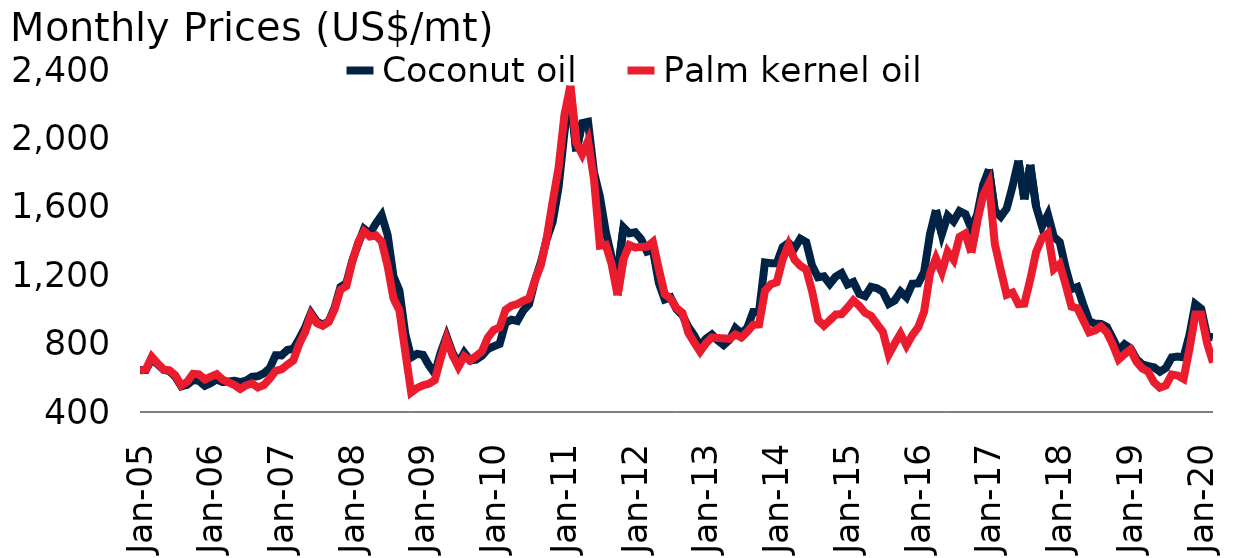
| Category | Coconut oil | Palm kernel oil |
|---|---|---|
| 2005-01-01 | 646 | 641.19 |
| 2005-02-01 | 646 | 649.4 |
| 2005-03-01 | 710 | 722.61 |
| 2005-04-01 | 679 | 684.33 |
| 2005-05-01 | 647 | 648.09 |
| 2005-06-01 | 638.75 | 644 |
| 2005-07-01 | 606 | 614.52 |
| 2005-08-01 | 550 | 555.22 |
| 2005-09-01 | 559 | 576.14 |
| 2005-10-01 | 587 | 623.33 |
| 2005-11-01 | 582 | 620.23 |
| 2005-12-01 | 553 | 590.8 |
| 2006-01-01 | 569 | 606.02 |
| 2006-02-01 | 591 | 621.13 |
| 2006-03-01 | 575 | 590 |
| 2006-04-01 | 578 | 573.75 |
| 2006-05-01 | 583 | 558.26 |
| 2006-06-01 | 575 | 534.77 |
| 2006-07-01 | 583.25 | 555.71 |
| 2006-08-01 | 606 | 566.85 |
| 2006-09-01 | 609 | 543.57 |
| 2006-10-01 | 626 | 557.61 |
| 2006-11-01 | 656 | 594.43 |
| 2006-12-01 | 731.667 | 640.71 |
| 2007-01-01 | 731 | 649.13 |
| 2007-02-01 | 763 | 676.75 |
| 2007-03-01 | 769 | 701.14 |
| 2007-04-01 | 827.5 | 797.26 |
| 2007-05-01 | 894 | 866.85 |
| 2007-06-01 | 979 | 968.33 |
| 2007-07-01 | 929 | 919.55 |
| 2007-08-01 | 910 | 904.02 |
| 2007-09-01 | 930 | 926.63 |
| 2007-10-01 | 1010 | 999.67 |
| 2007-11-01 | 1131 | 1115 |
| 2007-12-01 | 1153 | 1136.53 |
| 2008-01-01 | 1285 | 1278.18 |
| 2008-02-01 | 1382 | 1391.67 |
| 2008-03-01 | 1471 | 1456.39 |
| 2008-04-01 | 1443 | 1425.91 |
| 2008-05-01 | 1502 | 1432.5 |
| 2008-06-01 | 1551 | 1396.67 |
| 2008-07-01 | 1436 | 1253.48 |
| 2008-08-01 | 1193 | 1064.29 |
| 2008-09-01 | 1110 | 994.09 |
| 2008-10-01 | 856 | 750.65 |
| 2008-11-01 | 719 | 514.5 |
| 2008-12-01 | 740 | 540.24 |
| 2009-01-01 | 734 | 556 |
| 2009-02-01 | 673 | 565.25 |
| 2009-03-01 | 625 | 586.25 |
| 2009-04-01 | 747 | 713.5 |
| 2009-05-01 | 842.5 | 826.84 |
| 2009-06-01 | 747 | 732.62 |
| 2009-07-01 | 685 | 663.91 |
| 2009-08-01 | 747 | 726.19 |
| 2009-09-01 | 701 | 700.68 |
| 2009-10-01 | 706 | 727.05 |
| 2009-11-01 | 729 | 754.52 |
| 2009-12-01 | 768 | 835.45 |
| 2010-01-01 | 784 | 879.5 |
| 2010-02-01 | 798 | 894 |
| 2010-03-01 | 921 | 996.96 |
| 2010-04-01 | 940 | 1021.05 |
| 2010-05-01 | 932 | 1031.05 |
| 2010-06-01 | 993 | 1050 |
| 2010-07-01 | 1031 | 1063.86 |
| 2010-08-01 | 1170 | 1171.14 |
| 2010-09-01 | 1275 | 1259.66 |
| 2010-10-01 | 1412 | 1420.95 |
| 2010-11-01 | 1512 | 1631.14 |
| 2010-12-01 | 1715 | 1829.55 |
| 2011-01-01 | 2038 | 2139.05 |
| 2011-02-01 | 2256 | 2307.63 |
| 2011-03-01 | 1925 | 1975.22 |
| 2011-04-01 | 2089 | 1906.32 |
| 2011-05-01 | 2097 | 1985.48 |
| 2011-06-01 | 1803 | 1761.75 |
| 2011-07-01 | 1662 | 1372.62 |
| 2011-08-01 | 1454 | 1377.83 |
| 2011-09-01 | 1305 | 1264.32 |
| 2011-10-01 | 1208 | 1082.62 |
| 2011-11-01 | 1479 | 1294.32 |
| 2011-12-01 | 1445 | 1376.58 |
| 2012-01-01 | 1451 | 1362.05 |
| 2012-02-01 | 1411 | 1365.48 |
| 2012-03-01 | 1338 | 1366.43 |
| 2012-04-01 | 1348 | 1394.72 |
| 2012-05-01 | 1155 | 1236.75 |
| 2012-06-01 | 1058 | 1089.05 |
| 2012-07-01 | 1070 | 1063.18 |
| 2012-08-01 | 1001 | 1007.61 |
| 2012-09-01 | 967 | 980 |
| 2012-10-01 | 898 | 863.04 |
| 2012-11-01 | 848 | 806.7 |
| 2012-12-01 | 785 | 753.53 |
| 2013-01-01 | 828.64 | 801.36 |
| 2013-02-01 | 853.25 | 836 |
| 2013-03-01 | 818.75 | 832.75 |
| 2013-04-01 | 791.43 | 830.71 |
| 2013-05-01 | 822.5 | 827.5 |
| 2013-06-01 | 890.63 | 853.5 |
| 2013-07-01 | 860.43 | 835.54 |
| 2013-08-01 | 892.61 | 868.64 |
| 2013-09-01 | 985.24 | 909.76 |
| 2013-10-01 | 985.65 | 912.17 |
| 2013-11-01 | 1274.5 | 1108.1 |
| 2013-12-01 | 1270 | 1147 |
| 2014-01-01 | 1269.09 | 1158.64 |
| 2014-02-01 | 1364 | 1292 |
| 2014-03-01 | 1389.05 | 1376.9 |
| 2014-04-01 | 1356.13 | 1291.75 |
| 2014-05-01 | 1413.25 | 1255.25 |
| 2014-06-01 | 1393.25 | 1233.75 |
| 2014-07-01 | 1255.22 | 1106.3 |
| 2014-08-01 | 1187.62 | 938.81 |
| 2014-09-01 | 1193.41 | 904.55 |
| 2014-10-01 | 1148.7 | 936.09 |
| 2014-11-01 | 1191.63 | 970 |
| 2014-12-01 | 1212.14 | 972.26 |
| 2015-01-01 | 1145.71 | 1010.48 |
| 2015-02-01 | 1160.5 | 1052.37 |
| 2015-03-01 | 1090.68 | 1020.8 |
| 2015-04-01 | 1077.5 | 979.75 |
| 2015-05-01 | 1131.94 | 962.06 |
| 2015-06-01 | 1123.64 | 914.43 |
| 2015-07-01 | 1103.04 | 869.13 |
| 2015-08-01 | 1032.38 | 735.48 |
| 2015-09-01 | 1051.59 | 799.66 |
| 2015-10-01 | 1104.09 | 857.73 |
| 2015-11-01 | 1071.07 | 788.75 |
| 2015-12-01 | 1150 | 849.55 |
| 2016-01-01 | 1152 | 895.63 |
| 2016-02-01 | 1218.93 | 986.9 |
| 2016-03-01 | 1440.48 | 1210.6 |
| 2016-04-01 | 1580.95 | 1299.05 |
| 2016-05-01 | 1439.5 | 1218.25 |
| 2016-06-01 | 1547.95 | 1337.27 |
| 2016-07-01 | 1515 | 1290 |
| 2016-08-01 | 1575 | 1423.7 |
| 2016-09-01 | 1557.39 | 1443.86 |
| 2016-10-01 | 1473.57 | 1331.19 |
| 2016-11-01 | 1553.41 | 1512.95 |
| 2016-12-01 | 1727.14 | 1666.43 |
| 2017-01-01 | 1818.64 | 1737.27 |
| 2017-02-01 | 1575.63 | 1381.88 |
| 2017-03-01 | 1542.39 | 1229.57 |
| 2017-04-01 | 1589.72 | 1085.56 |
| 2017-05-01 | 1719.29 | 1098.57 |
| 2017-06-01 | 1869.76 | 1030.83 |
| 2017-07-01 | 1644.05 | 1033.57 |
| 2017-08-01 | 1845 | 1174.35 |
| 2017-09-01 | 1600.95 | 1336.05 |
| 2017-10-01 | 1484.77 | 1418.86 |
| 2017-11-01 | 1554.32 | 1444.77 |
| 2017-12-01 | 1425 | 1235.63 |
| 2018-01-01 | 1393.86 | 1265 |
| 2018-02-01 | 1244.25 | 1145.38 |
| 2018-03-01 | 1118.63 | 1016.19 |
| 2018-04-01 | 1131.18 | 1006.71 |
| 2018-05-01 | 1027.75 | 935.25 |
| 2018-06-01 | 931.19 | 865.71 |
| 2018-07-01 | 916.25 | 877.16 |
| 2018-08-01 | 915.22 | 900.22 |
| 2018-09-01 | 897.13 | 865.63 |
| 2018-10-01 | 830.25 | 794.49 |
| 2018-11-01 | 759.26 | 707.62 |
| 2018-12-01 | 796.27 | 738.36 |
| 2019-01-01 | 773.07 | 765 |
| 2019-02-01 | 710.43 | 694.67 |
| 2019-03-01 | 678.56 | 654.72 |
| 2019-04-01 | 668.63 | 636.23 |
| 2019-05-01 | 661.17 | 573.36 |
| 2019-06-01 | 635.6 | 542.24 |
| 2019-07-01 | 657.31 | 555.03 |
| 2019-08-01 | 719.28 | 619.33 |
| 2019-09-01 | 724.03 | 613.15 |
| 2019-10-01 | 719.52 | 593.74 |
| 2019-11-01 | 848.92 | 767.44 |
| 2019-12-01 | 1031.29 | 969.77 |
| 2020-01-01 | 1003.72 | 970.53 |
| 2020-02-01 | 844.12 | 801.84 |
| 2020-03-01 | 836.35 | 689.37 |